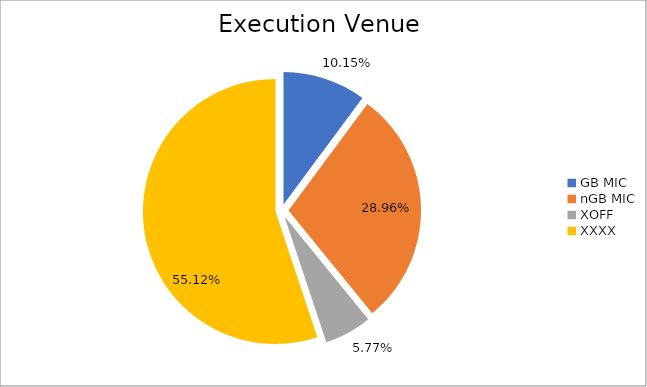
| Category | Series 0 |
|---|---|
| GB MIC | 812248.751 |
| nGB MIC | 2316952.537 |
| XOFF | 461894.065 |
| XXXX | 4409569.984 |